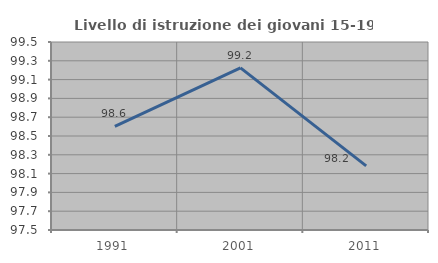
| Category | Livello di istruzione dei giovani 15-19 anni |
|---|---|
| 1991.0 | 98.601 |
| 2001.0 | 99.225 |
| 2011.0 | 98.182 |